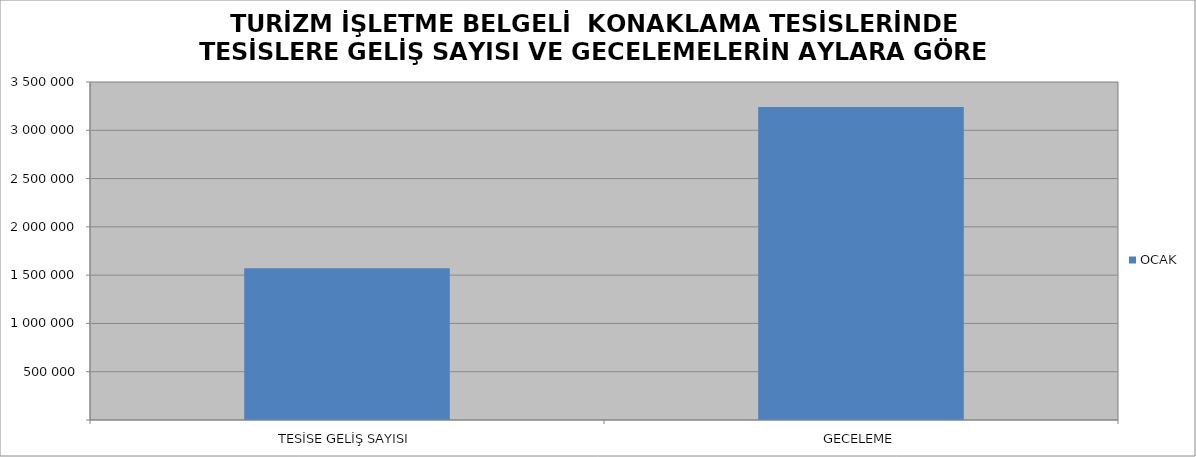
| Category | OCAK |
|---|---|
| TESİSE GELİŞ SAYISI | 1571594 |
| GECELEME | 3239980 |